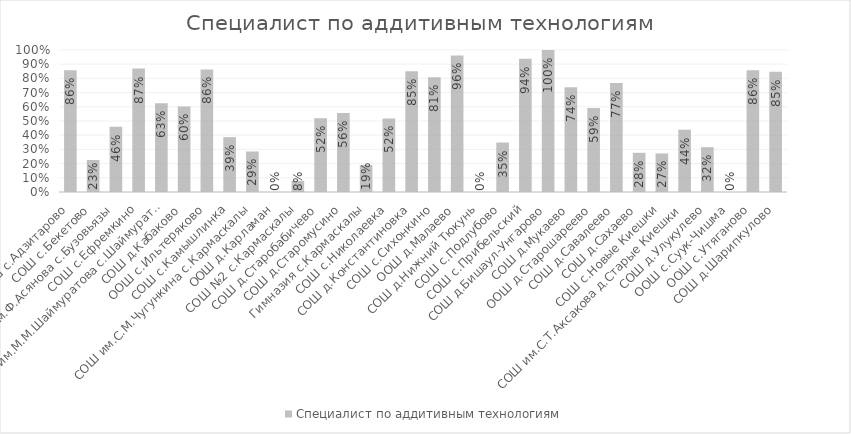
| Category | Специалист по аддитивным технологиям |
|---|---|
| СОШ с.Адзитарово | 0.857 |
| СОШ с.Бекетово | 0.226 |
| СОШ им.Ф.Асянова с.Бузовьязы | 0.46 |
| СОШ с.Ефремкино | 0.87 |
| СОШ им.М.М.Шаймуратова с.Шаймуратово | 0.625 |
| СОШ д.Кабаково | 0.603 |
| ООШ с.Ильтеряково | 0.863 |
| СОШ с.Камышлинка | 0.386 |
| СОШ им.С.М.Чугункина с.Кармаскалы | 0.285 |
| ООШ д.Карламан | 0 |
| СОШ №2 с.Кармаскалы | 0.079 |
| СОШ д.Старобабичево | 0.519 |
| СОШ д.Старомусино | 0.556 |
| Гимназия с.Кармаскалы | 0.19 |
| СОШ с.Николаевка | 0.518 |
| СОШ д.Константиновка | 0.85 |
| СОШ с.Сихонкино | 0.809 |
| ООШ д.Малаево | 0.962 |
| СОШ д.Нижний Тюкунь | 0 |
| СОШ с.Подлубово | 0.348 |
| СОШ с.Прибельский | 0.939 |
| СОШ д.Бишаул-Унгарово | 1 |
| СОШ д.Мукаево | 0.737 |
| ООШ д.Старошареево | 0.591 |
| СОШ д.Савалеево | 0.768 |
| СОШ д.Сахаево | 0.276 |
| СОШ с.Новые Киешки | 0.271 |
| СОШ им.С.Т.Аксакова д.Старые Киешки | 0.439 |
| СОШ д.Улукулево | 0.316 |
| ООШ с.Суук-Чишма | 0 |
| ООШ с.Утяганово | 0.857 |
| СОШ д.Шарипкулово | 0.846 |